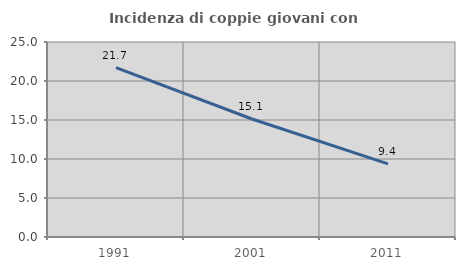
| Category | Incidenza di coppie giovani con figli |
|---|---|
| 1991.0 | 21.725 |
| 2001.0 | 15.126 |
| 2011.0 | 9.375 |